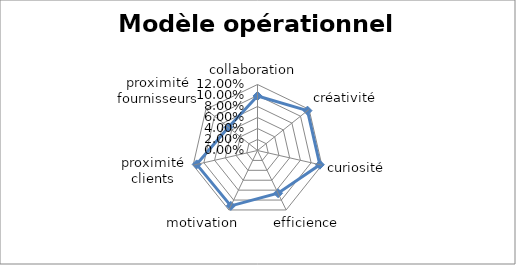
| Category | Series 0 |
|---|---|
| collaboration  | 0.099 |
| créativité | 0.116 |
| curiosité | 0.116 |
| efficience | 0.086 |
| motivation | 0.112 |
| proximité clients | 0.113 |
| proximité fournisseurs | 0.068 |